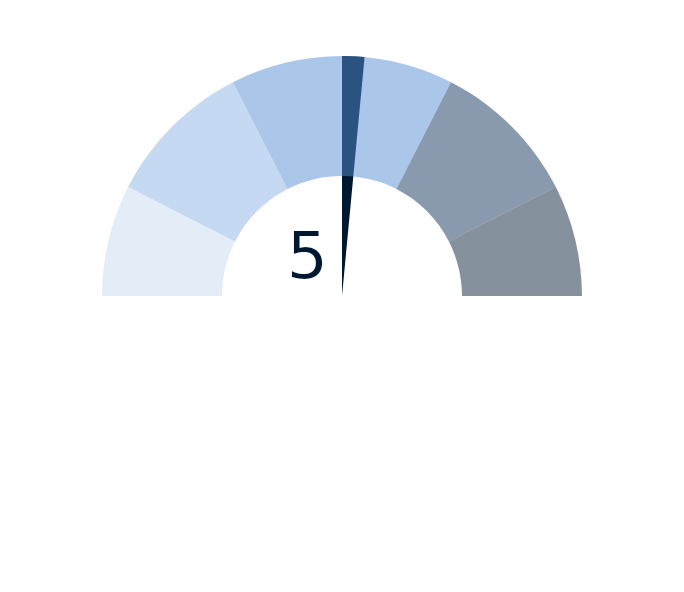
| Category | factor |
|---|---|
| 0 | 5 |
| 1 | 0.3 |
| 2 | 14.7 |